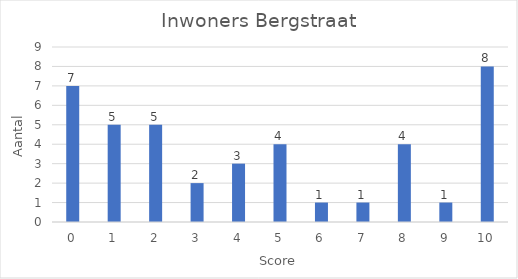
| Category | Aantal |
|---|---|
| 0.0 | 7 |
| 1.0 | 5 |
| 2.0 | 5 |
| 3.0 | 2 |
| 4.0 | 3 |
| 5.0 | 4 |
| 6.0 | 1 |
| 7.0 | 1 |
| 8.0 | 4 |
| 9.0 | 1 |
| 10.0 | 8 |